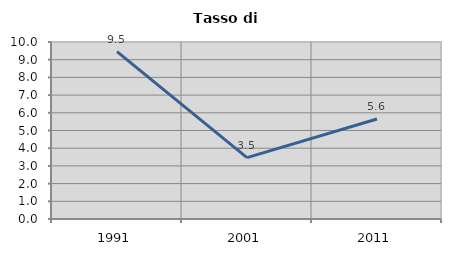
| Category | Tasso di disoccupazione   |
|---|---|
| 1991.0 | 9.456 |
| 2001.0 | 3.471 |
| 2011.0 | 5.648 |